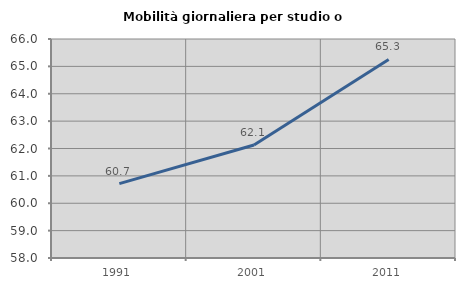
| Category | Mobilità giornaliera per studio o lavoro |
|---|---|
| 1991.0 | 60.715 |
| 2001.0 | 62.127 |
| 2011.0 | 65.253 |